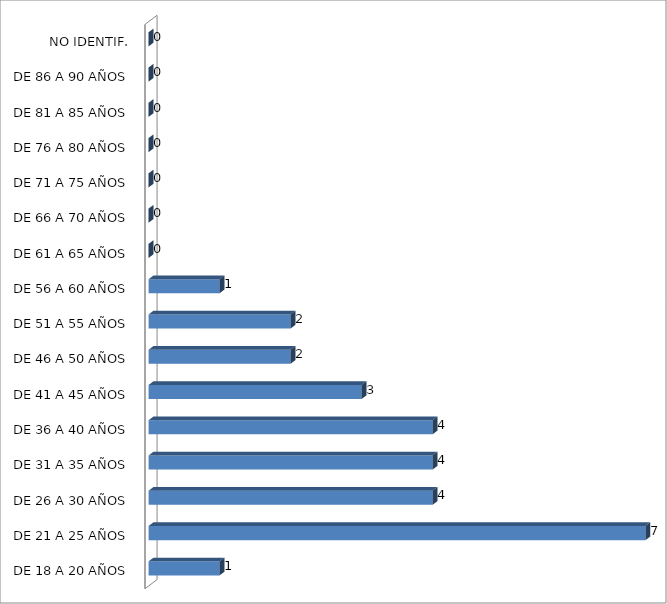
| Category | ESTADO  DE EBRIEDAD |
|---|---|
| DE 18 A 20 AÑOS | 1 |
| DE 21 A 25 AÑOS | 7 |
| DE 26 A 30 AÑOS | 4 |
| DE 31 A 35 AÑOS | 4 |
| DE 36 A 40 AÑOS | 4 |
| DE 41 A 45 AÑOS | 3 |
| DE 46 A 50 AÑOS | 2 |
| DE 51 A 55 AÑOS | 2 |
| DE 56 A 60 AÑOS | 1 |
| DE 61 A 65 AÑOS | 0 |
| DE 66 A 70 AÑOS | 0 |
| DE 71 A 75 AÑOS | 0 |
| DE 76 A 80 AÑOS | 0 |
| DE 81 A 85 AÑOS | 0 |
| DE 86 A 90 AÑOS | 0 |
| NO IDENTIF. | 0 |